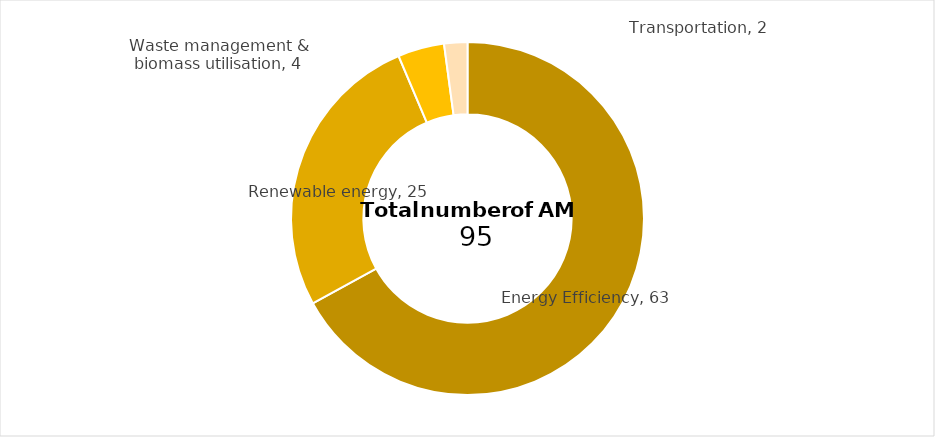
| Category | Series 0 |
|---|---|
| 0 | 63 |
| 1 | 25 |
| 2 | 4 |
| 3 | 2 |